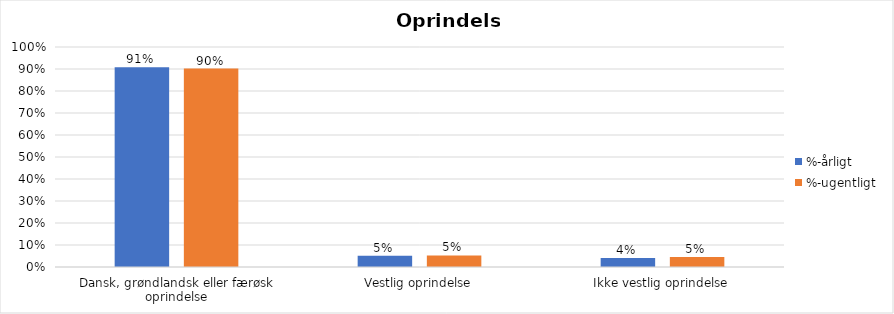
| Category | %-årligt | %-ugentligt |
|---|---|---|
| Dansk, grøndlandsk eller færøsk oprindelse | 0.908 | 0.902 |
| Vestlig oprindelse | 0.051 | 0.053 |
| Ikke vestlig oprindelse | 0.041 | 0.045 |